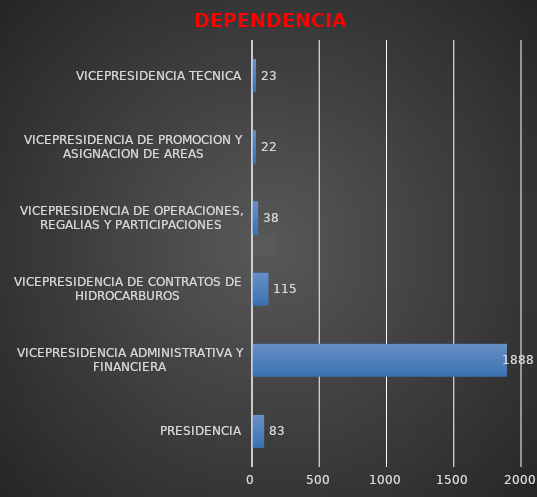
| Category | DEPENDENCIAS INFORME  2020 |
|---|---|
| PRESIDENCIA | 83 |
| VICEPRESIDENCIA ADMINISTRATIVA Y FINANCIERA | 1888 |
| VICEPRESIDENCIA DE CONTRATOS DE HIDROCARBUROS | 115 |
| VICEPRESIDENCIA DE OPERACIONES, REGALIAS Y PARTICIPACIONES | 38 |
| VICEPRESIDENCIA DE PROMOCION Y ASIGNACION DE AREAS | 22 |
| VICEPRESIDENCIA TECNICA | 23 |